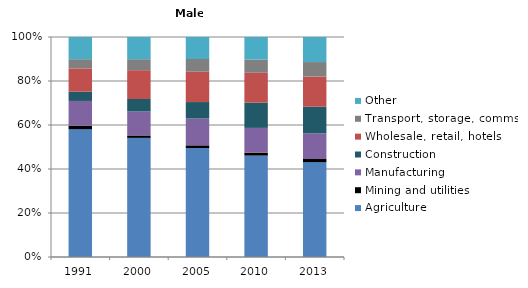
| Category | Agriculture | Mining and utilities | Manufacturing | Construction | Wholesale, retail, hotels | Transport, storage, comms | Other |
|---|---|---|---|---|---|---|---|
| 1991.0 | 58.2 | 1.5 | 11.3 | 4.2 | 10.6 | 4.2 | 10.1 |
| 2000.0 | 54.2 | 1.1 | 10.9 | 5.7 | 13.1 | 5 | 10.1 |
| 2005.0 | 49.6 | 1.2 | 12.2 | 7.5 | 13.8 | 5.8 | 10 |
| 2010.0 | 46.2 | 1.3 | 11.3 | 11.5 | 13.6 | 6 | 10.3 |
| 2013.0 | 43.2 | 1.4 | 11.7 | 12.1 | 13.7 | 6.6 | 11.4 |